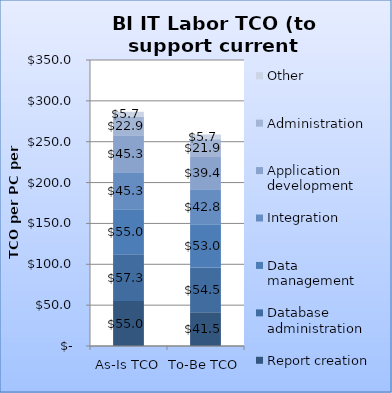
| Category | Report creation | Database administration | Data management | Integration | Application development | Administration | Other |
|---|---|---|---|---|---|---|---|
| As-Is TCO | 55.038 | 57.295 | 55.038 | 45.329 | 45.329 | 22.918 | 5.729 |
| To-Be TCO | 41.454 | 54.504 | 52.961 | 42.817 | 39.443 | 21.898 | 5.729 |